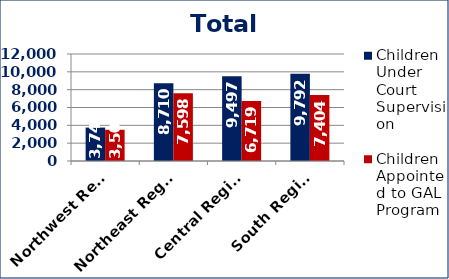
| Category | Children Under Court Supervision  | Children Appointed to GAL Program  |
|---|---|---|
| Northwest Region | 3747 | 3503 |
| Northeast Region | 8710 | 7598 |
| Central Region | 9497 | 6719 |
| South Region | 9792 | 7404 |